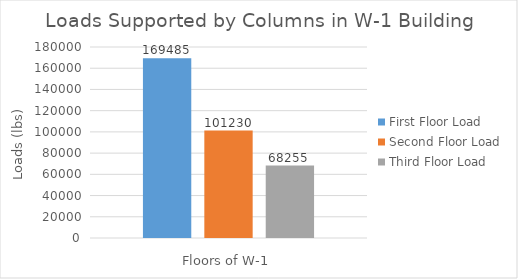
| Category | First Floor Load | Second Floor Load | Third Floor Load |
|---|---|---|---|
| 0 | 169485.12 | 101230.08 | 68255.04 |